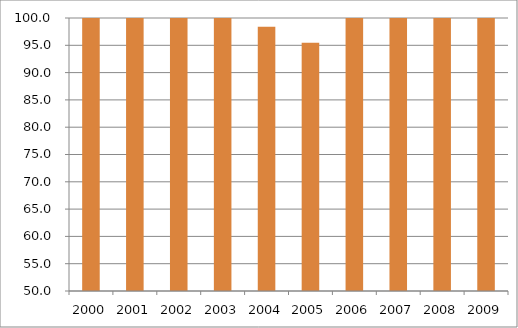
| Category | Região Norte |
|---|---|
| 2000.0 | 105.9 |
| 2001.0 | 105.86 |
| 2002.0 | 107.77 |
| 2003.0 | 105.89 |
| 2004.0 | 98.4 |
| 2005.0 | 95.48 |
| 2006.0 | 107.79 |
| 2007.0 | 106.61 |
| 2008.0 | 103.48 |
| 2009.0 | 100.82 |